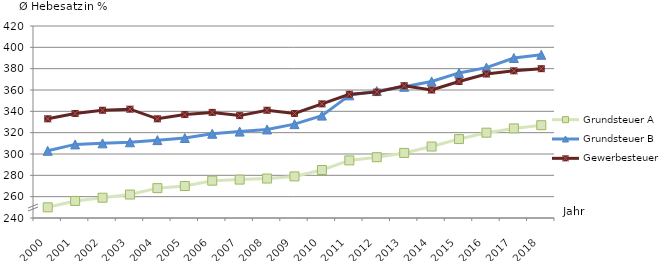
| Category | Grundsteuer A | Grundsteuer B | Gewerbesteuer |
|---|---|---|---|
| 2000.0 | 250 | 303 | 333 |
| 2001.0 | 256 | 309 | 338 |
| 2002.0 | 259 | 310 | 341 |
| 2003.0 | 262 | 311 | 342 |
| 2004.0 | 268 | 313 | 333 |
| 2005.0 | 270 | 315 | 337 |
| 2006.0 | 275 | 319 | 339 |
| 2007.0 | 276 | 321 | 336 |
| 2008.0 | 277 | 323 | 341 |
| 2009.0 | 279 | 328 | 338 |
| 2010.0 | 285 | 336 | 347 |
| 2011.0 | 294 | 355 | 356 |
| 2012.0 | 297 | 359 | 358 |
| 2013.0 | 301 | 363 | 364 |
| 2014.0 | 307 | 368 | 360 |
| 2015.0 | 314 | 376 | 368 |
| 2016.0 | 320 | 381 | 375 |
| 2017.0 | 324 | 390 | 378 |
| 2018.0 | 327 | 393 | 380 |